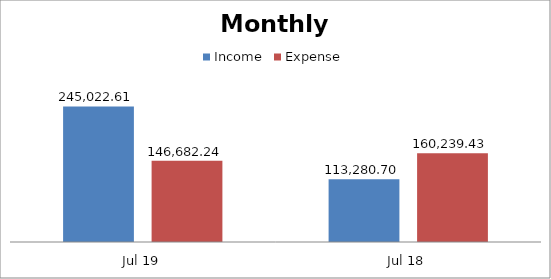
| Category | Income | Expense |
|---|---|---|
| Jul 19 | 245022.61 | 146682.24 |
| Jul 18 | 113280.7 | 160239.43 |